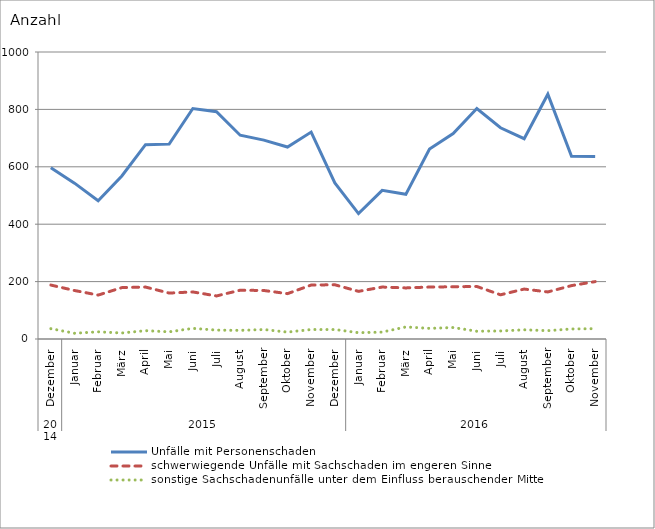
| Category | Unfälle mit Personenschaden | schwerwiegende Unfälle mit Sachschaden im engeren Sinne | sonstige Sachschadenunfälle unter dem Einfluss berauschender Mittel |
|---|---|---|---|
| 0 | 597 | 188 | 36 |
| 1 | 543 | 169 | 20 |
| 2 | 482 | 153 | 25 |
| 3 | 568 | 179 | 21 |
| 4 | 677 | 181 | 29 |
| 5 | 679 | 160 | 25 |
| 6 | 803 | 164 | 37 |
| 7 | 792 | 150 | 31 |
| 8 | 710 | 170 | 30 |
| 9 | 693 | 169 | 33 |
| 10 | 669 | 158 | 24 |
| 11 | 721 | 188 | 33 |
| 12 | 544 | 189 | 33 |
| 13 | 437 | 166 | 22 |
| 14 | 518 | 181 | 24 |
| 15 | 504 | 178 | 42 |
| 16 | 662 | 181 | 37 |
| 17 | 716 | 182 | 40 |
| 18 | 803 | 183 | 27 |
| 19 | 736 | 154 | 28 |
| 20 | 698 | 174 | 32 |
| 21 | 853 | 164 | 29 |
| 22 | 637 | 186 | 35 |
| 23 | 636 | 200 | 36 |